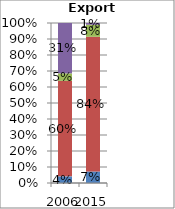
| Category | Other commercial services | Travel | Transport | Goods-related services |
|---|---|---|---|---|
| 2006.0 | 0.041 | 0.597 | 0.047 | 0.315 |
| 2015.0 | 0.072 | 0.842 | 0.075 | 0.011 |